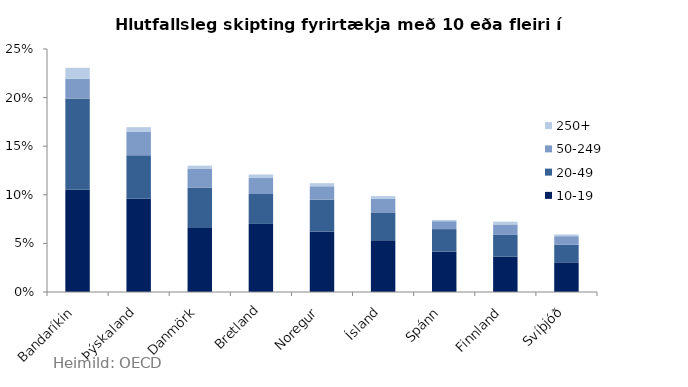
| Category | 10-19 | 20-49 | 50-249 | 250+ |
|---|---|---|---|---|
| Bandaríkin | 0.105 | 0.094 | 0.02 | 0.011 |
| Þýskaland | 0.096 | 0.045 | 0.024 | 0.005 |
| Danmörk | 0.066 | 0.042 | 0.019 | 0.003 |
| Bretland | 0.07 | 0.031 | 0.016 | 0.004 |
| Noregur | 0.062 | 0.033 | 0.014 | 0.003 |
| Ísland | 0.053 | 0.029 | 0.014 | 0.003 |
| Spánn | 0.041 | 0.023 | 0.008 | 0.001 |
| Finnland | 0.036 | 0.022 | 0.011 | 0.003 |
| Svíþjóð | 0.031 | 0.018 | 0.009 | 0.002 |